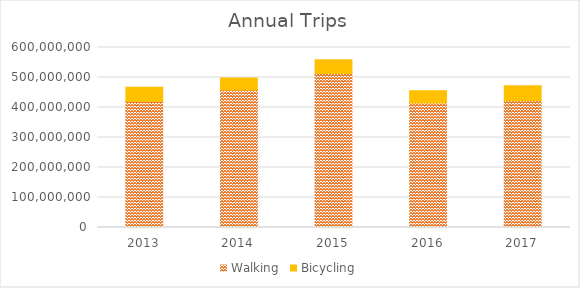
| Category | Walking | Bicycling |
|---|---|---|
| 2013 | 420194985.947 | 47367128.095 |
| 2014 | 458215548.407 | 40109910.734 |
| 2015 | 513110126.173 | 45826970.283 |
| 2016 | 415052396.98 | 40960129.917 |
| 2017 | 422651910.589 | 49511712.581 |